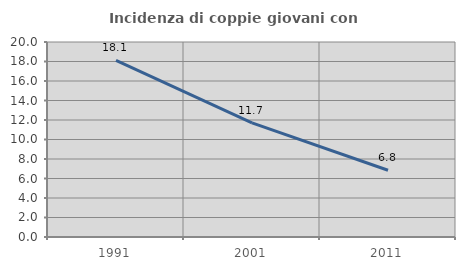
| Category | Incidenza di coppie giovani con figli |
|---|---|
| 1991.0 | 18.108 |
| 2001.0 | 11.705 |
| 2011.0 | 6.844 |